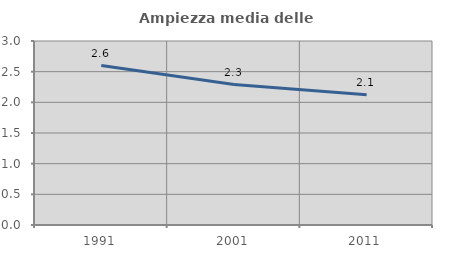
| Category | Ampiezza media delle famiglie |
|---|---|
| 1991.0 | 2.599 |
| 2001.0 | 2.29 |
| 2011.0 | 2.124 |